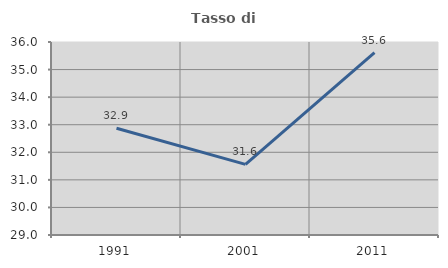
| Category | Tasso di occupazione   |
|---|---|
| 1991.0 | 32.871 |
| 2001.0 | 31.56 |
| 2011.0 | 35.611 |